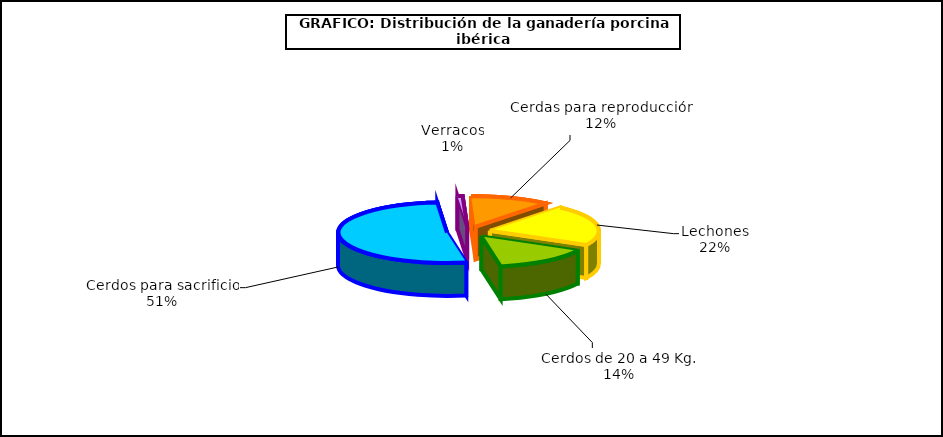
| Category | año2008 |
|---|---|
| 0 | 522981.453 |
| 1 | 348449.388 |
| 2 | 1242232.906 |
| 3 | 18363.688 |
| 4 | 284530.025 |